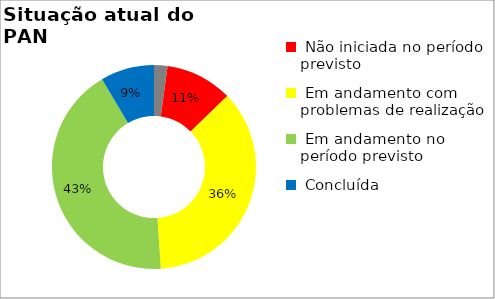
| Category | Series 0 |
|---|---|
|  Início planejado é posterior ao período monitorado | 0.021 |
|  Não iniciada no período previsto | 0.106 |
|  Em andamento com problemas de realização | 0.362 |
|  Em andamento no período previsto  | 0.426 |
|  Concluída | 0.085 |